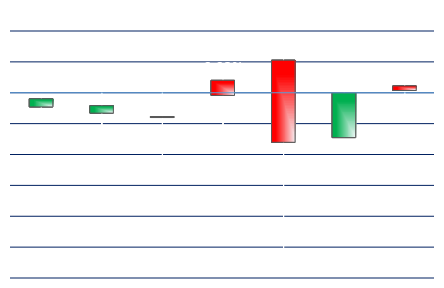
| Category | Series 0 | Series 1 | Series 2 | Series 3 |
|---|---|---|---|---|
| FVAZ19 | -0.001 | 0 | -0.002 | 0 |
| TYAZ19 | -0.001 | 0 | -0.003 | -0.001 |
| USAZ19 | -0.002 | 0.001 | -0.005 | -0.002 |
| DBZ19 | 0.001 | 0.001 | -0.003 | 0 |
| FGBXZ19 | 0.002 | 0.002 | -0.01 | -0.003 |
| QGAZ19 | -0.003 | 0.002 | -0.003 | 0 |
| DLZ19 | 0 | 0.001 | -0.001 | 0 |